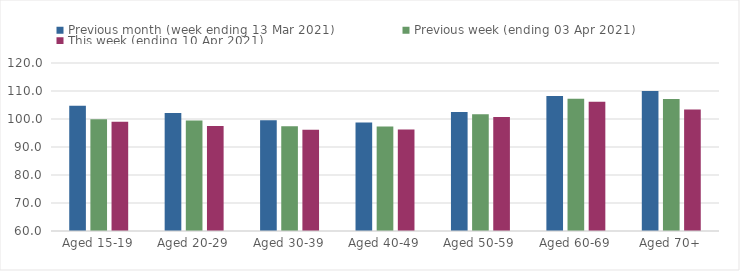
| Category | Previous month (week ending 13 Mar 2021) | Previous week (ending 03 Apr 2021) | This week (ending 10 Apr 2021) |
|---|---|---|---|
| Aged 15-19 | 104.72 | 99.87 | 98.98 |
| Aged 20-29 | 102.16 | 99.47 | 97.53 |
| Aged 30-39 | 99.59 | 97.39 | 96.16 |
| Aged 40-49 | 98.75 | 97.36 | 96.27 |
| Aged 50-59 | 102.52 | 101.72 | 100.73 |
| Aged 60-69 | 108.22 | 107.25 | 106.12 |
| Aged 70+ | 109.97 | 107.13 | 103.43 |